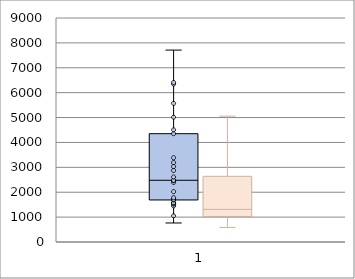
| Category | Series 0 | Series 1 | Series 2 |
|---|---|---|---|
| 0 | 1138.44 | 4252.26 | 1121.58 |
| 1 | 688.068 | 1270.56 | 850.53 |